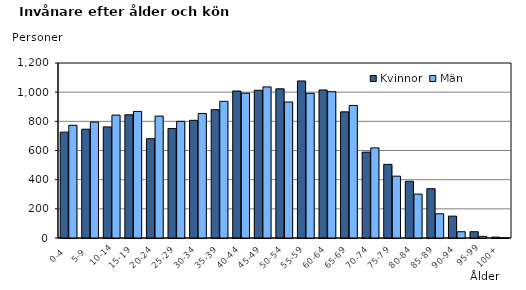
| Category | Kvinnor | Män |
|---|---|---|
|   0-4  | 726 | 773 |
|   5-9  | 746 | 795 |
| 10-14 | 762 | 843 |
| 15-19  | 845 | 868 |
| 20-24  | 681 | 836 |
| 25-29  | 751 | 800 |
| 30-34  | 807 | 854 |
| 35-39  | 880 | 937 |
| 40-44  | 1008 | 993 |
| 45-49  | 1013 | 1036 |
| 50-54  | 1023 | 933 |
| 55-59  | 1077 | 992 |
| 60-64  | 1015 | 1003 |
| 65-69  | 865 | 909 |
| 70-74  | 589 | 618 |
| 75-79  | 505 | 424 |
| 80-84  | 389 | 301 |
| 85-89  | 338 | 166 |
| 90-94  | 150 | 43 |
| 95-99 | 43 | 11 |
| 100+ | 6 | 1 |